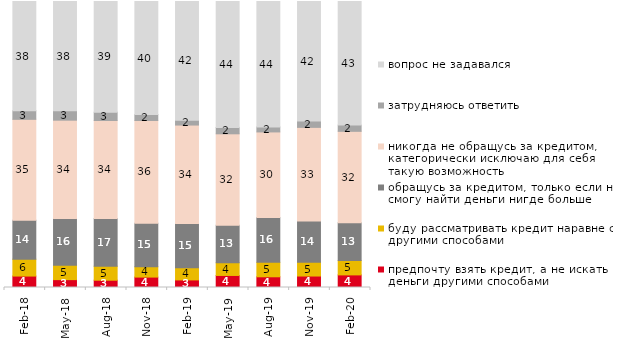
| Category | предпочту взять кредит, а не искать деньги другими способами | буду рассматривать кредит наравне с другими способами | обращусь за кредитом, только если не смогу найти деньги нигде больше | никогда не обращусь за кредитом, категорически исключаю для себя такую возможность | затрудняюсь ответить | вопрос не задавался |
|---|---|---|---|---|---|---|
| 2018-02-01 | 4 | 5.9 | 13.6 | 35.3 | 3 | 38.2 |
| 2018-05-01 | 2.75 | 5.05 | 16.35 | 34.35 | 3.3 | 38.2 |
| 2018-08-01 | 2.55 | 4.9 | 16.7 | 34.25 | 2.9 | 38.7 |
| 2018-11-01 | 3.643 | 3.593 | 15.269 | 35.878 | 2.096 | 39.521 |
| 2019-02-01 | 2.65 | 4.25 | 15.45 | 34.45 | 1.65 | 41.55 |
| 2019-05-01 | 4.21 | 4.458 | 13.125 | 31.947 | 2.229 | 44.032 |
| 2019-08-01 | 3.746 | 5.045 | 15.684 | 29.92 | 1.748 | 43.856 |
| 2019-11-01 | 4.01 | 4.851 | 14.356 | 32.772 | 2.228 | 41.782 |
| 2020-02-01 | 4.406 | 5 | 13.218 | 31.98 | 2.178 | 43.218 |